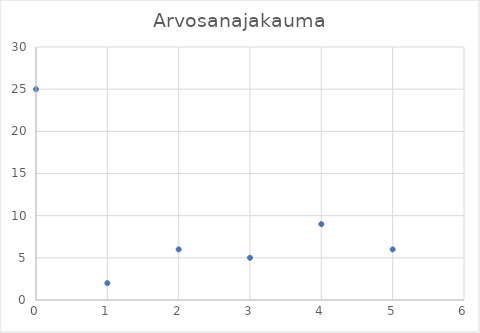
| Category | Series 0 |
|---|---|
| 0.0 | 25 |
| 1.0 | 2 |
| 2.0 | 6 |
| 3.0 | 5 |
| 4.0 | 9 |
| 5.0 | 6 |